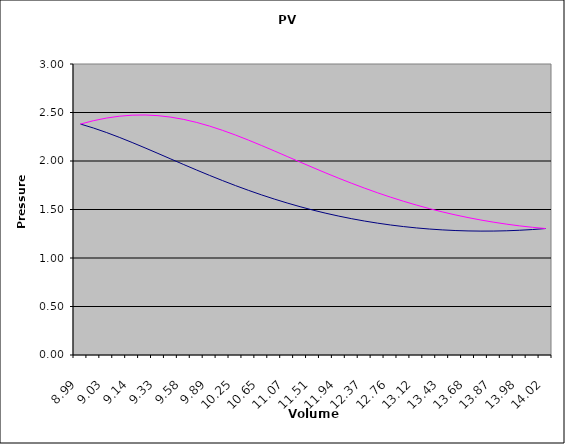
| Category | Series 0 | Series 1 |
|---|---|---|
| 8.992996720331742 | 2.381 | 2.381 |
| 9.002562320217494 | 2.34 | 2.415 |
| 9.031186319883748 | 2.294 | 2.442 |
| 9.078650873409403 | 2.244 | 2.462 |
| 9.144594746882246 | 2.191 | 2.472 |
| 9.22851606760715 | 2.135 | 2.474 |
| 9.329776143660318 | 2.078 | 2.467 |
| 9.447604324720482 | 2.02 | 2.452 |
| 9.581103867183174 | 1.963 | 2.429 |
| 9.729258758921024 | 1.906 | 2.397 |
| 9.890941451749535 | 1.851 | 2.36 |
| 10.064921442749604 | 1.798 | 2.316 |
| 10.249874639137733 | 1.747 | 2.268 |
| 10.444393435411612 | 1.698 | 2.216 |
| 10.646997426077936 | 1.651 | 2.161 |
| 10.856144672432102 | 1.608 | 2.104 |
| 11.070243437642795 | 1.567 | 2.047 |
| 11.287664300830391 | 1.529 | 1.989 |
| 11.506752557943722 | 1.494 | 1.932 |
| 11.725840815057056 | 1.461 | 1.876 |
| 11.943261678244653 | 1.432 | 1.822 |
| 12.157360443455342 | 1.405 | 1.77 |
| 12.36650768980951 | 1.381 | 1.72 |
| 12.569111680475833 | 1.359 | 1.672 |
| 12.763630476749713 | 1.34 | 1.627 |
| 12.948583673137842 | 1.324 | 1.585 |
| 13.12256366413791 | 1.31 | 1.546 |
| 13.284246356966422 | 1.299 | 1.509 |
| 13.432401248704272 | 1.29 | 1.476 |
| 13.565900791166964 | 1.283 | 1.445 |
| 13.683728972227128 | 1.279 | 1.417 |
| 13.784989048280298 | 1.277 | 1.391 |
| 13.868910369005201 | 1.278 | 1.369 |
| 13.934854242478044 | 1.281 | 1.349 |
| 13.9823187960037 | 1.286 | 1.331 |
| 14.010942795669953 | 1.294 | 1.316 |
| 14.020508395555703 | 1.304 | 1.304 |